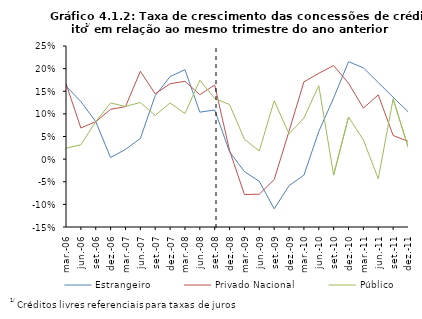
| Category | Estrangeiro | Privado Nacional | Público |
|---|---|---|---|
| 2006-03-01 | 0.162 | 0.167 | 0.024 |
| 2006-06-01 | 0.127 | 0.069 | 0.032 |
| 2006-09-01 | 0.083 | 0.083 | 0.083 |
| 2006-12-01 | 0.003 | 0.11 | 0.124 |
| 2007-03-01 | 0.021 | 0.116 | 0.116 |
| 2007-06-01 | 0.046 | 0.194 | 0.125 |
| 2007-09-01 | 0.14 | 0.144 | 0.097 |
| 2007-12-01 | 0.182 | 0.167 | 0.124 |
| 2008-03-01 | 0.198 | 0.172 | 0.101 |
| 2008-06-01 | 0.104 | 0.143 | 0.174 |
| 2008-09-01 | 0.109 | 0.164 | 0.134 |
| 2008-12-01 | 0.016 | 0.019 | 0.121 |
| 2009-03-01 | -0.028 | -0.078 | 0.044 |
| 2009-06-01 | -0.049 | -0.077 | 0.018 |
| 2009-09-01 | -0.11 | -0.045 | 0.129 |
| 2009-12-01 | -0.059 | 0.062 | 0.056 |
| 2010-03-01 | -0.036 | 0.171 | 0.091 |
| 2010-06-01 | 0.061 | 0.19 | 0.162 |
| 2010-09-01 | 0.135 | 0.207 | -0.035 |
| 2010-12-01 | 0.215 | 0.168 | 0.093 |
| 2011-03-01 | 0.202 | 0.113 | 0.042 |
| 2011-06-01 | 0.169 | 0.142 | -0.043 |
| 2011-09-01 | 0.137 | 0.052 | 0.133 |
| 2011-12-01 | 0.105 | 0.039 | 0.027 |